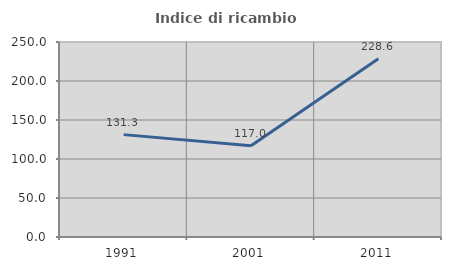
| Category | Indice di ricambio occupazionale  |
|---|---|
| 1991.0 | 131.25 |
| 2001.0 | 117.021 |
| 2011.0 | 228.571 |